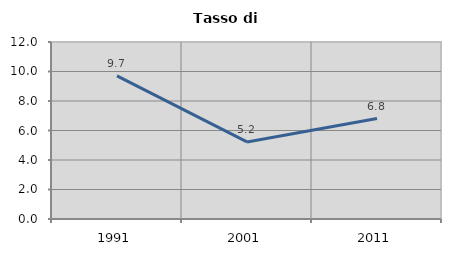
| Category | Tasso di disoccupazione   |
|---|---|
| 1991.0 | 9.708 |
| 2001.0 | 5.227 |
| 2011.0 | 6.812 |